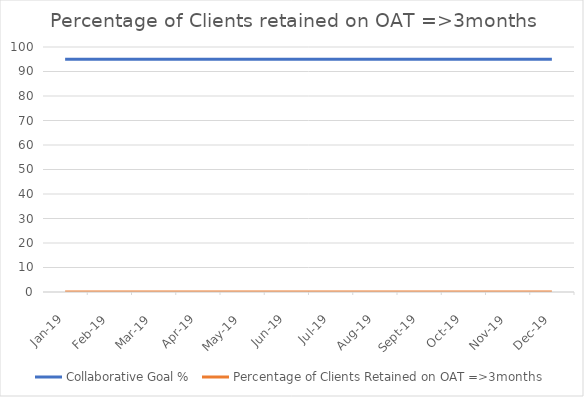
| Category | Collaborative Goal % | Percentage of Clients Retained on OAT =>3months |
|---|---|---|
| 2019-01-01 | 95 | 0 |
| 2019-02-01 | 95 | 0 |
| 2019-03-01 | 95 | 0 |
| 2019-04-01 | 95 | 0 |
| 2019-05-01 | 95 | 0 |
| 2019-06-01 | 95 | 0 |
| 2019-07-01 | 95 | 0 |
| 2019-08-01 | 95 | 0 |
| 2019-09-01 | 95 | 0 |
| 2019-10-01 | 95 | 0 |
| 2019-11-01 | 95 | 0 |
| 2019-12-01 | 95 | 0 |